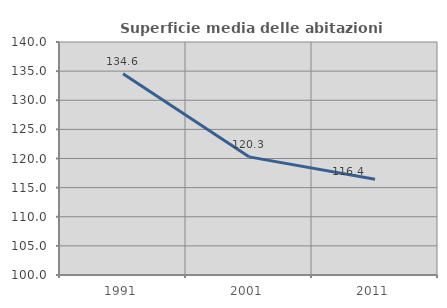
| Category | Superficie media delle abitazioni occupate |
|---|---|
| 1991.0 | 134.552 |
| 2001.0 | 120.282 |
| 2011.0 | 116.431 |